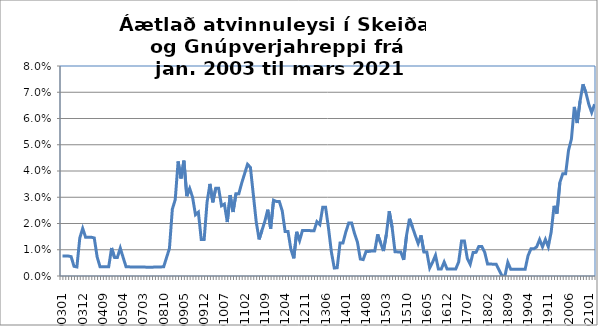
| Category | Series 0 |
|---|---|
| 200301 | 0.008 |
| 200302 | 0.008 |
| 200303 | 0.008 |
| 200304 | 0.007 |
| 200305 | 0.004 |
| 200308 | 0.003 |
| 200311 | 0.014 |
| 200312 | 0.018 |
| 200401 | 0.015 |
| 200402 | 0.015 |
| 200403 | 0.015 |
| 200404 | 0.014 |
| 200405 | 0.007 |
| 200407 | 0.004 |
| 200409 | 0.004 |
| 200410 | 0.004 |
| 200411 | 0.004 |
| 200412 | 0.011 |
| 200501 | 0.007 |
| 200502 | 0.007 |
| 200503 | 0.011 |
| 200504 | 0.007 |
| 200505 | 0.003 |
| 200506 | 0.003 |
| 200611 | 0.003 |
| 200612 | 0.003 |
| 200701 | 0.003 |
| 200702 | 0.003 |
| 200703 | 0.003 |
| 200705 | 0.003 |
| 200706 | 0.003 |
| 200709 | 0.003 |
| 200710 | 0.003 |
| 200711 | 0.003 |
| 200712 | 0.003 |
| 200810 | 0.004 |
| 200811 | 0.007 |
| 200812 | 0.011 |
| 200901 | 0.025 |
| 200902 | 0.029 |
| 200903 | 0.044 |
| 200904 | 0.037 |
| 200905 | 0.044 |
| 200906 | 0.03 |
| 200907 | 0.033 |
| 200908 | 0.03 |
| 200909 | 0.023 |
| 200910 | 0.024 |
| 200911 | 0.014 |
| 200912 | 0.014 |
| 201001 | 0.028 |
| 201002 | 0.035 |
| 201003 | 0.028 |
| 201004 | 0.033 |
| 201005 | 0.033 |
| 201006 | 0.027 |
| 201007 | 0.027 |
| 201008 | 0.021 |
| 201009 | 0.031 |
| 201010 | 0.024 |
| 201011 | 0.031 |
| 201012 | 0.031 |
| 201101 | 0.035 |
| 201102 | 0.039 |
| 201103 | 0.043 |
| 201104 | 0.041 |
| 201105 | 0.031 |
| 201106 | 0.021 |
| 201107 | 0.014 |
| 201108 | 0.017 |
| 201109 | 0.021 |
| 201110 | 0.025 |
| 201111 | 0.018 |
| 201112 | 0.029 |
| 201201 | 0.028 |
| 201202 | 0.028 |
| 201203 | 0.025 |
| 201204 | 0.017 |
| 201205 | 0.017 |
| 201206 | 0.01 |
| 201207 | 0.007 |
| 201208 | 0.017 |
| 201209 | 0.013 |
| 201210 | 0.017 |
| 201211 | 0.017 |
| 201212 | 0.017 |
| 201301 | 0.017 |
| 201302 | 0.017 |
| 201303 | 0.021 |
| 201304 | 0.02 |
| 201305 | 0.026 |
| 201306 | 0.026 |
| 201307 | 0.018 |
| 201308 | 0.009 |
| 201309 | 0.003 |
| 201310 | 0.003 |
| 201311 | 0.013 |
| 201312 | 0.013 |
| 201401 | 0.017 |
| 201402 | 0.02 |
| 201403 | 0.02 |
| 201404 | 0.016 |
| 201405 | 0.013 |
| 201406 | 0.006 |
| 201407 | 0.006 |
| 201408 | 0.009 |
| 201409 | 0.009 |
| 201410 | 0.01 |
| 201411 | 0.01 |
| 201412 | 0.016 |
| 2001501 | 0.013 |
| 201502 | 0.009 |
| 201503 | 0.016 |
| 201504 | 0.025 |
| 201505 | 0.019 |
| 201506 | 0.009 |
| 201507 | 0.009 |
| 201508 | 0.009 |
| 201509 | 0.006 |
| 201510 | 0.016 |
| 201511 | 0.022 |
| 201512 | 0.019 |
| 201601 | 0.015 |
| 201602 | 0.012 |
| 201603 | 0.015 |
| 201604 | 0.009 |
| 201605 | 0.009 |
| 201606 | 0.003 |
| 201607 | 0.005 |
| 201608 | 0.008 |
| 201609 | 0.003 |
| 201610 | 0.003 |
| 201611 | 0.005 |
| 201612 | 0.003 |
| 201701 | 0.003 |
| 201702 | 0.003 |
| 201703 | 0.003 |
| 201704 | 0.005 |
| 201705 | 0.013 |
| 201706 | 0.013 |
| 201707 | 0.007 |
| 201708 | 0.004 |
| 201709 | 0.009 |
| 201710 | 0.009 |
| 201711 | 0.011 |
| 201712 | 0.011 |
| 201801 | 0.009 |
| 201802 | 0.005 |
| 201803 | 0.005 |
| 201804 | 0.004 |
| 201805 | 0.004 |
| 201806 | 0.002 |
| 201807 | 0 |
| 201808 | 0 |
| 201809 | 0.005 |
| 201810 | 0.003 |
| 201811 | 0.003 |
| 201812 | 0.003 |
| 201901 | 0.003 |
| 201902 | 0.003 |
| 201903 | 0.003 |
| 201904 | 0.008 |
| 201905 | 0.01 |
| 201906 | 0.01 |
| 201907 | 0.011 |
| 201908 | 0.014 |
| 201909 | 0.011 |
| 201910 | 0.014 |
| 201911 | 0.011 |
| 201912 | 0.017 |
| 202001 | 0.027 |
| 202002 | 0.024 |
| 202003 | 0.036 |
| 202004 | 0.039 |
| 202005 | 0.039 |
| 202006 | 0.048 |
| 202007 | 0.052 |
| 202008 | 0.064 |
| 202009 | 0.058 |
| 202010 | 0.067 |
| 202011 | 0.073 |
| 202012 | 0.07 |
| 202101 | 0.065 |
| 202102 | 0.062 |
| 202103 | 0.065 |